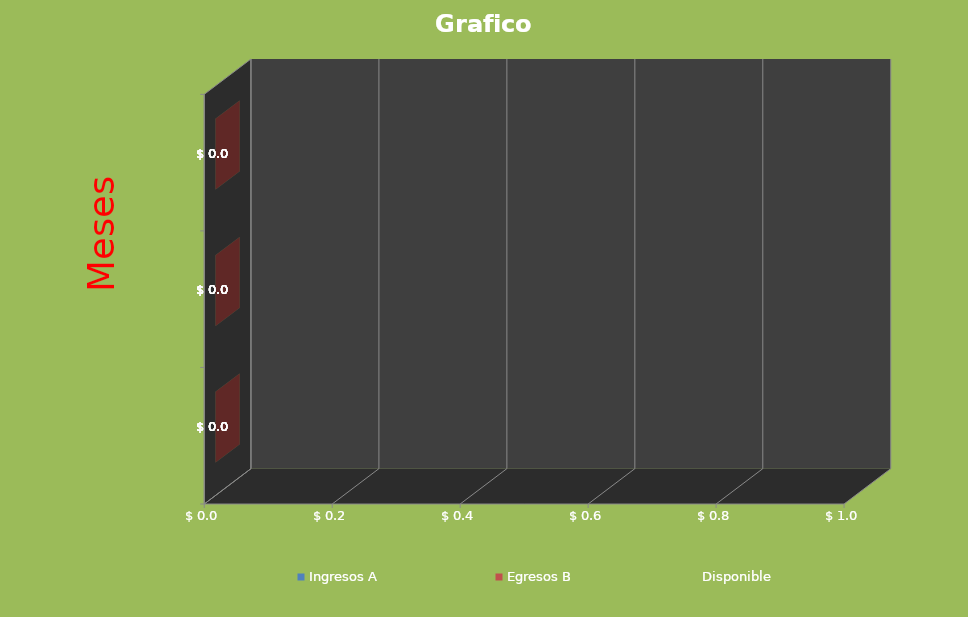
| Category | Ingresos A | Egresos B | Disponible |
|---|---|---|---|
| 0 | 0 | 0 | 0 |
| 1 | 0 | 0 | 0 |
| 2 | 0 | 0 | 0 |